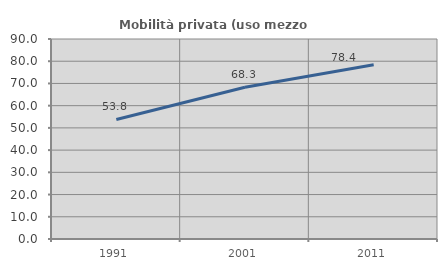
| Category | Mobilità privata (uso mezzo privato) |
|---|---|
| 1991.0 | 53.782 |
| 2001.0 | 68.323 |
| 2011.0 | 78.385 |